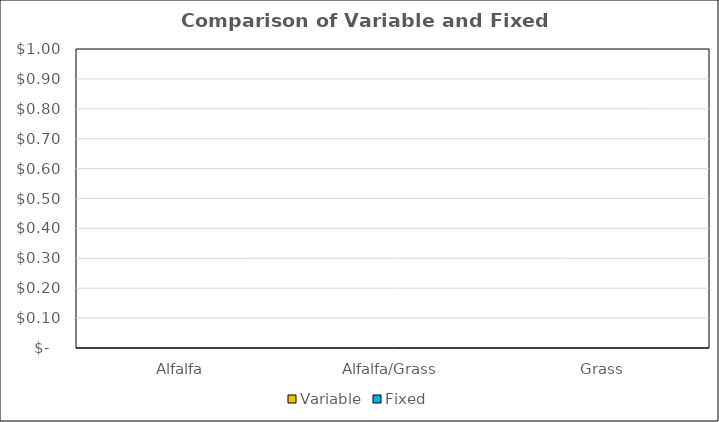
| Category | Variable | Fixed |
|---|---|---|
| Alfalfa | 0 | 0 |
| Alfalfa/Grass | 0 | 0 |
| Grass | 0 | 0 |